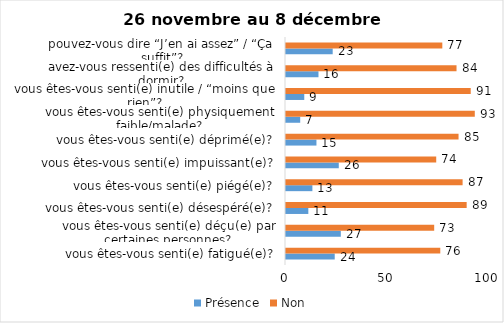
| Category | Présence | Non |
|---|---|---|
| vous êtes-vous senti(e) fatigué(e)? | 24 | 76 |
| vous êtes-vous senti(e) déçu(e) par certaines personnes? | 27 | 73 |
| vous êtes-vous senti(e) désespéré(e)? | 11 | 89 |
| vous êtes-vous senti(e) piégé(e)? | 13 | 87 |
| vous êtes-vous senti(e) impuissant(e)? | 26 | 74 |
| vous êtes-vous senti(e) déprimé(e)? | 15 | 85 |
| vous êtes-vous senti(e) physiquement faible/malade? | 7 | 93 |
| vous êtes-vous senti(e) inutile / “moins que rien”? | 9 | 91 |
| avez-vous ressenti(e) des difficultés à dormir? | 16 | 84 |
| pouvez-vous dire “J’en ai assez” / “Ça suffit”? | 23 | 77 |